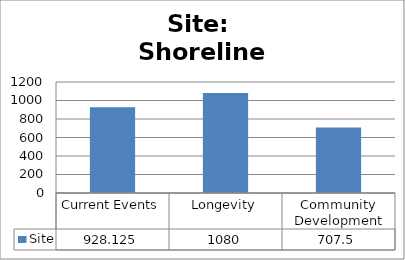
| Category | Site |
|---|---|
| Current Events | 928.125 |
| Longevity | 1080 |
| Community Development | 707.5 |